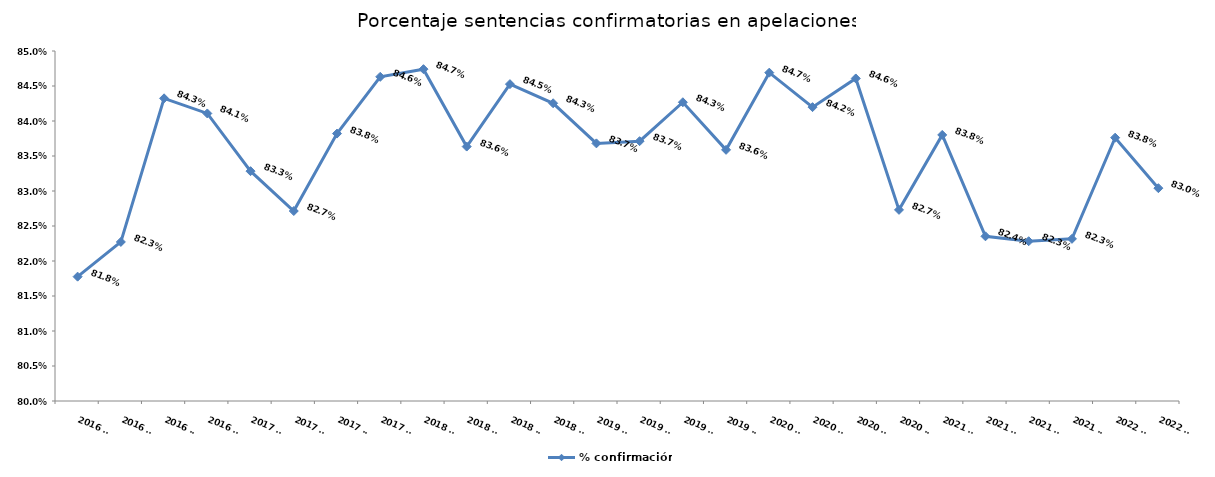
| Category | % confirmación |
|---|---|
| 2016 T1 | 0.818 |
| 2016 T2 | 0.823 |
| 2016 T3 | 0.843 |
| 2016 T4 | 0.841 |
| 2017 T1 | 0.833 |
| 2017 T2 | 0.827 |
| 2017 T3 | 0.838 |
| 2017 T4 | 0.846 |
| 2018 T1 | 0.847 |
| 2018 T2 | 0.836 |
| 2018 T3 | 0.845 |
| 2018 T4 | 0.843 |
| 2019 T1 | 0.837 |
| 2019 T2 | 0.837 |
| 2019 T3 | 0.843 |
| 2019 T4 | 0.836 |
| 2020 T1 | 0.847 |
| 2020 T2 | 0.842 |
| 2020 T3 | 0.846 |
| 2020 T4 | 0.827 |
| 2021 T1 | 0.838 |
| 2021 T2 | 0.824 |
| 2021 T3 | 0.823 |
| 2021 T4 | 0.823 |
| 2022 T1 | 0.838 |
| 2022 T2 | 0.83 |